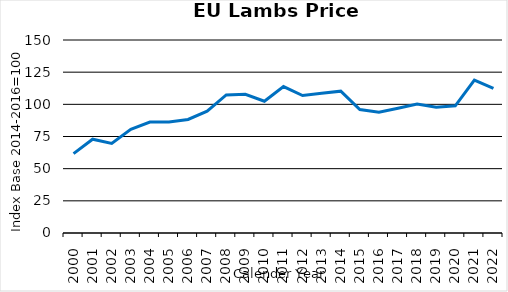
| Category | DE, ES, FR, IE, PT |
|---|---|
| 2000.0 | 61.696 |
| 2001.0 | 72.904 |
| 2002.0 | 69.617 |
| 2003.0 | 80.631 |
| 2004.0 | 86.267 |
| 2005.0 | 86.188 |
| 2006.0 | 88.259 |
| 2007.0 | 94.745 |
| 2008.0 | 107.339 |
| 2009.0 | 107.835 |
| 2010.0 | 102.388 |
| 2011.0 | 113.771 |
| 2012.0 | 106.863 |
| 2013.0 | 108.566 |
| 2014.0 | 110.251 |
| 2015.0 | 95.963 |
| 2016.0 | 93.787 |
| 2017.0 | 96.928 |
| 2018.0 | 100.295 |
| 2019.0 | 97.785 |
| 2020.0 | 98.822 |
| 2021.0 | 118.858 |
| 2022.0 | 112.352 |